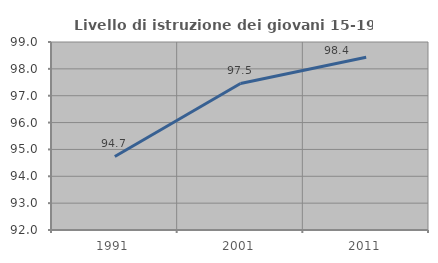
| Category | Livello di istruzione dei giovani 15-19 anni |
|---|---|
| 1991.0 | 94.737 |
| 2001.0 | 97.458 |
| 2011.0 | 98.431 |